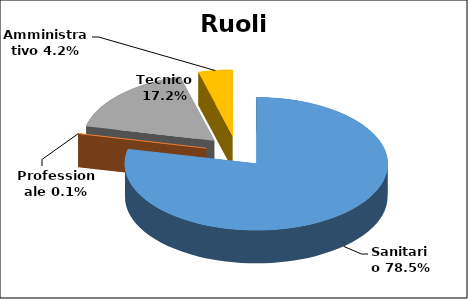
| Category | Series 0 |
|---|---|
| Sanitario | 0.785 |
| Professionale | 0.001 |
| Tecnico | 0.172 |
| Amministrativo | 0.042 |